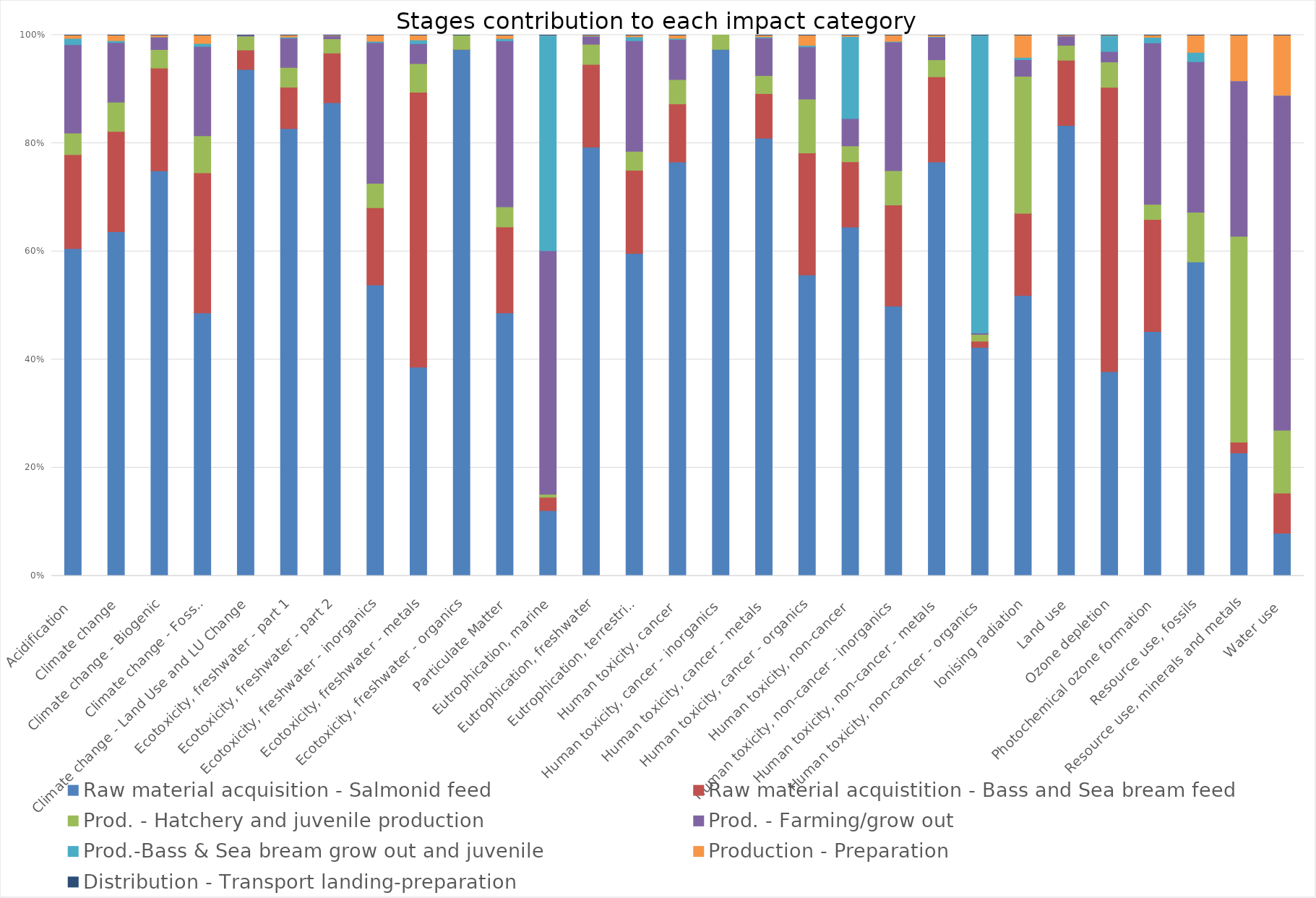
| Category | Raw material acquisition - Salmonid feed | Raw material acquistition - Bass and Sea bream feed | Prod. - Hatchery and juvenile production | Prod. - Farming/grow out | Prod.-Bass & Sea bream grow out and juvenile | Production - Preparation | Distribution - Transport landing-preparation |
|---|---|---|---|---|---|---|---|
| Acidification | 0.583 | 0.167 | 0.038 | 0.158 | 0.011 | 0.006 | 0 |
| Climate change | 0.588 | 0.172 | 0.05 | 0.102 | 0.003 | 0.009 | 0 |
| Climate change - Biogenic | 0.746 | 0.189 | 0.034 | 0.023 | 0 | 0.003 | 0 |
| Climate change - Fossil | 0.433 | 0.231 | 0.061 | 0.147 | 0.005 | 0.014 | 0 |
| Climate change - Land Use and LU Change | 0.936 | 0.036 | 0.026 | 0.002 | 0 | 0 | 0 |
| Ecotoxicity, freshwater - part 1 | 0.804 | 0.074 | 0.035 | 0.053 | 0.002 | 0.003 | 0 |
| Ecotoxicity, freshwater - part 2 | 0.874 | 0.092 | 0.026 | 0.006 | 0 | 0.001 | 0 |
| Ecotoxicity, freshwater - inorganics | 0.472 | 0.125 | 0.04 | 0.228 | 0.002 | 0.01 | 0 |
| Ecotoxicity, freshwater - metals | 0.382 | 0.504 | 0.052 | 0.037 | 0.007 | 0.009 | 0 |
| Ecotoxicity, freshwater - organics | 0.974 | 0 | 0.026 | 0 | 0 | 0 | 0 |
| Particulate Matter | 0.473 | 0.155 | 0.036 | 0.299 | 0.004 | 0.006 | 0 |
| Eutrophication, marine | 0.121 | 0.025 | 0.006 | 0.45 | 0.398 | 0 | 0 |
| Eutrophication, freshwater | 0.792 | 0.153 | 0.037 | 0.015 | 0.001 | 0.001 | 0 |
| Eutrophication, terrestrial | 0.587 | 0.151 | 0.034 | 0.201 | 0.007 | 0.003 | 0 |
| Human toxicity, cancer | 0.722 | 0.101 | 0.042 | 0.07 | 0.002 | 0.006 | 0 |
| Human toxicity, cancer - inorganics | 0.974 | 0 | 0.026 | 0 | 0 | 0 | 0 |
| Human toxicity, cancer - metals | 0.79 | 0.08 | 0.033 | 0.068 | 0.002 | 0.003 | 0 |
| Human toxicity, cancer - organics | 0.451 | 0.183 | 0.081 | 0.078 | 0.002 | 0.015 | 0 |
| Human toxicity, non-cancer | 0.627 | 0.117 | 0.029 | 0.049 | 0.147 | 0.003 | 0 |
| Human toxicity, non-cancer - inorganics | 0.474 | 0.177 | 0.06 | 0.226 | 0.001 | 0.011 | 0 |
| Human toxicity, non-cancer - metals | 0.738 | 0.152 | 0.03 | 0.04 | 0.001 | 0.003 | 0 |
| Human toxicity, non-cancer - organics | 0.422 | 0.011 | 0.012 | 0.003 | 0.55 | 0 | 0 |
| Ionising radiation | 0.493 | 0.145 | 0.241 | 0.029 | 0.004 | 0.039 | 0 |
| Land use | 0.829 | 0.12 | 0.027 | 0.017 | 0 | 0.002 | 0 |
| Ozone depletion | 0.378 | 0.526 | 0.047 | 0.019 | 0.03 | 0.001 | 0 |
| Photochemical ozone formation | 0.439 | 0.201 | 0.027 | 0.29 | 0.01 | 0.004 | 0 |
| Resource use, fossils | 0.471 | 0 | 0.074 | 0.226 | 0.014 | 0.026 | 0 |
| Resource use, minerals and metals | 0.227 | 0.02 | 0.38 | 0.287 | 0 | 0.084 | 0 |
| Water use | 0.049 | 0.047 | 0.073 | 0.388 | 0 | 0.07 | 0 |